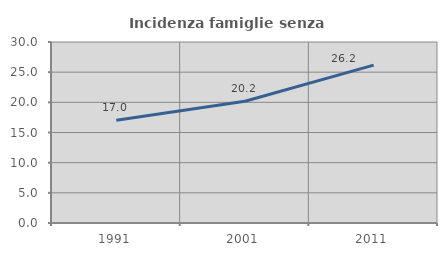
| Category | Incidenza famiglie senza nuclei |
|---|---|
| 1991.0 | 17.036 |
| 2001.0 | 20.186 |
| 2011.0 | 26.176 |